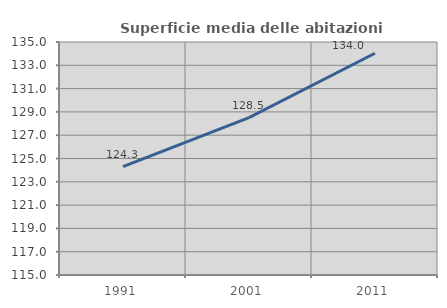
| Category | Superficie media delle abitazioni occupate |
|---|---|
| 1991.0 | 124.308 |
| 2001.0 | 128.506 |
| 2011.0 | 134.032 |